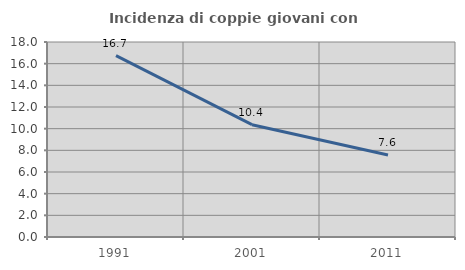
| Category | Incidenza di coppie giovani con figli |
|---|---|
| 1991.0 | 16.746 |
| 2001.0 | 10.366 |
| 2011.0 | 7.567 |